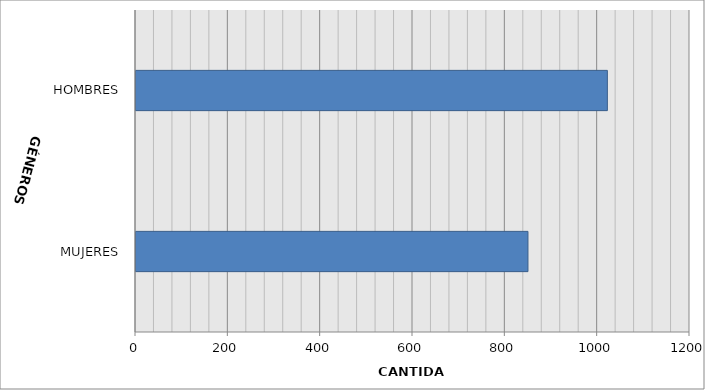
| Category | Series 0 |
|---|---|
| MUJERES | 849 |
| HOMBRES | 1021 |